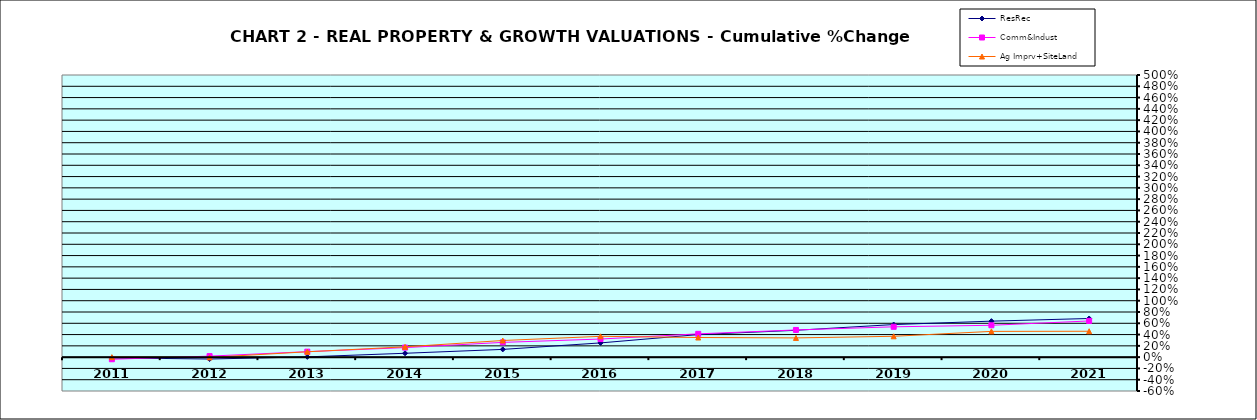
| Category | ResRec | Comm&Indust | Ag Imprv+SiteLand |
|---|---|---|---|
| 2011.0 | -0.013 | -0.037 | 0 |
| 2012.0 | -0.034 | 0.018 | -0.005 |
| 2013.0 | 0.005 | 0.097 | 0.095 |
| 2014.0 | 0.069 | 0.169 | 0.183 |
| 2015.0 | 0.137 | 0.262 | 0.295 |
| 2016.0 | 0.252 | 0.321 | 0.369 |
| 2017.0 | 0.4 | 0.413 | 0.348 |
| 2018.0 | 0.476 | 0.482 | 0.341 |
| 2019.0 | 0.578 | 0.538 | 0.37 |
| 2020.0 | 0.638 | 0.565 | 0.457 |
| 2021.0 | 0.685 | 0.641 | 0.459 |